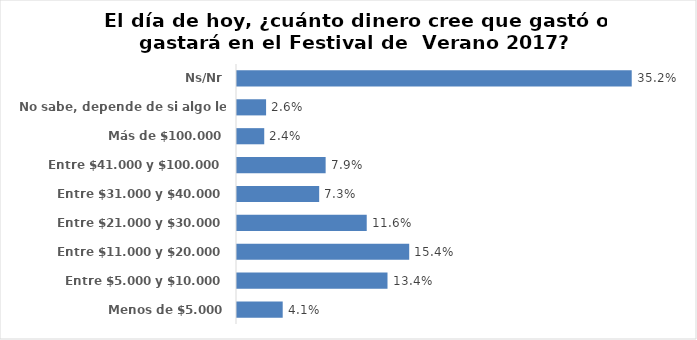
| Category | Series 0 |
|---|---|
| Menos de $5.000 | 0.041 |
| Entre $5.000 y $10.000 | 0.134 |
| Entre $11.000 y $20.000 | 0.154 |
| Entre $21.000 y $30.000 | 0.116 |
| Entre $31.000 y $40.000 | 0.073 |
| Entre $41.000 y $100.000 | 0.079 |
| Más de $100.000 | 0.024 |
| No sabe, depende de si algo le gusta | 0.026 |
| Ns/Nr | 0.352 |